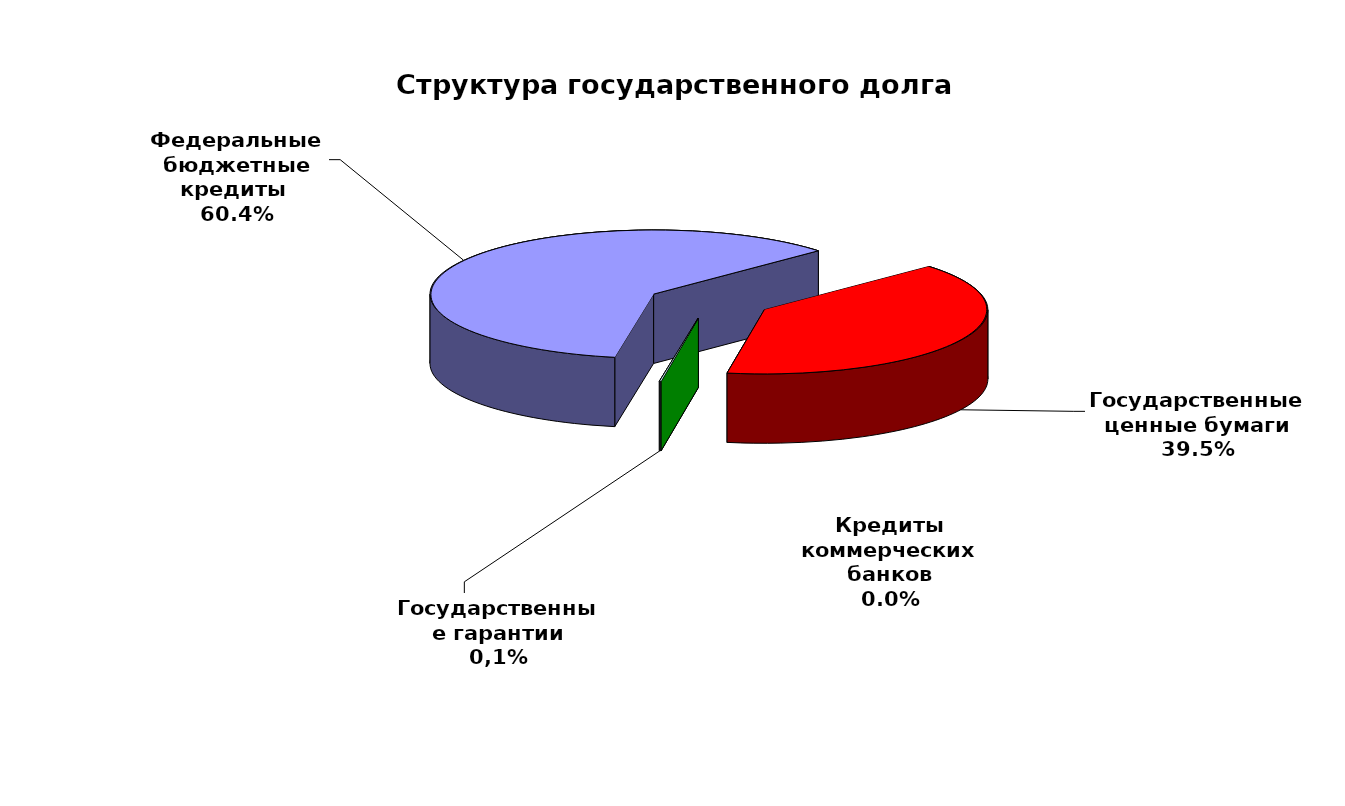
| Category | Series 0 |
|---|---|
| Федеральные бюджетные кредиты  | 71000838.41 |
| Государственные ценные бумаги | 46400000 |
| Кредиты коммерческих банков | 0 |
| Государственные гарантии | 134576.199 |